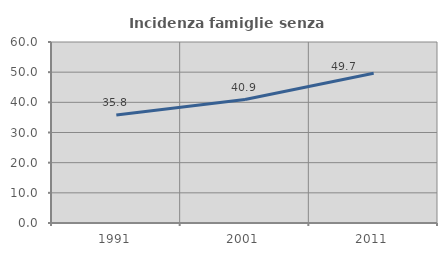
| Category | Incidenza famiglie senza nuclei |
|---|---|
| 1991.0 | 35.783 |
| 2001.0 | 40.917 |
| 2011.0 | 49.654 |